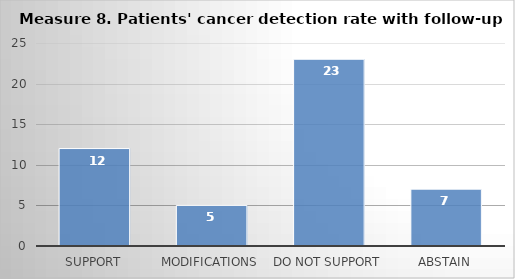
| Category | Series 0 |
|---|---|
| Support | 12 |
| Modifications | 5 |
| Do not support | 23 |
| Abstain | 7 |